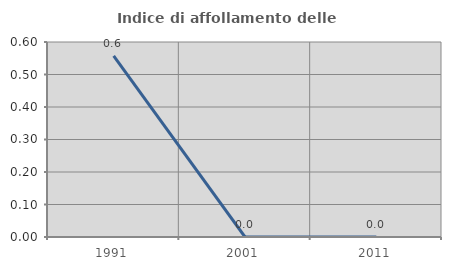
| Category | Indice di affollamento delle abitazioni  |
|---|---|
| 1991.0 | 0.557 |
| 2001.0 | 0 |
| 2011.0 | 0 |